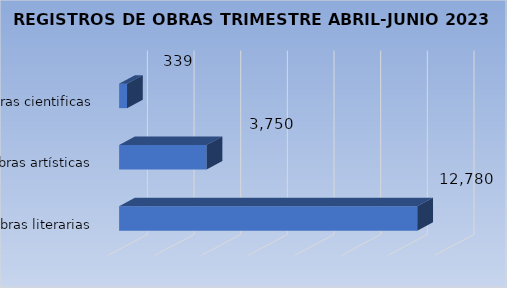
| Category | Cantidad |
|---|---|
| Obras literarias | 12780 |
| Obras artísticas | 3750 |
| Obras cientificas | 339 |